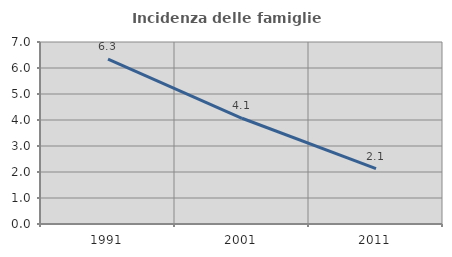
| Category | Incidenza delle famiglie numerose |
|---|---|
| 1991.0 | 6.337 |
| 2001.0 | 4.067 |
| 2011.0 | 2.13 |